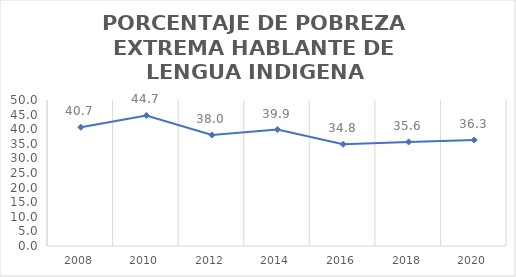
| Category | Series 0 |
|---|---|
| 2008.0 | 40.668 |
| 2010.0 | 44.72 |
| 2012.0 | 38.003 |
| 2014.0 | 39.872 |
| 2016.0 | 34.823 |
| 2018.0 | 35.641 |
| 2020.0 | 36.289 |